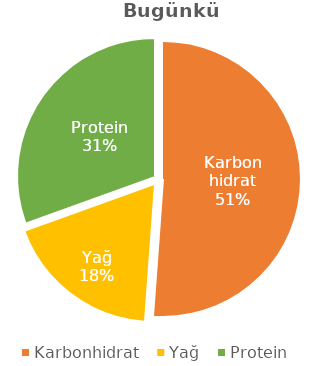
| Category | Series 0 |
|---|---|
| Karbonhidrat | 301 |
| Yağ | 107.9 |
| Protein | 179.5 |